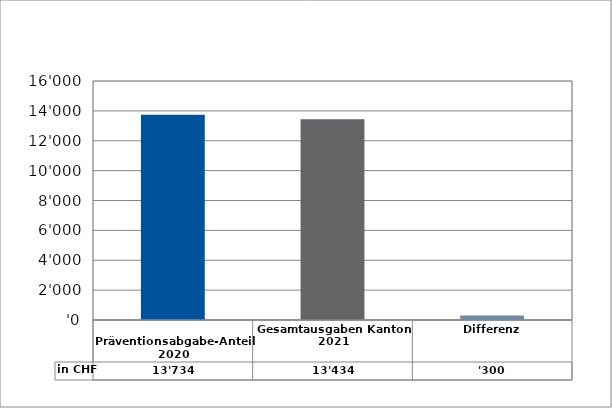
| Category | in CHF |
|---|---|
| 
Präventionsabgabe-Anteil 2020

 | 13734 |
| Gesamtausgaben Kanton 2021
 | 13434 |
| Differenz | 300 |